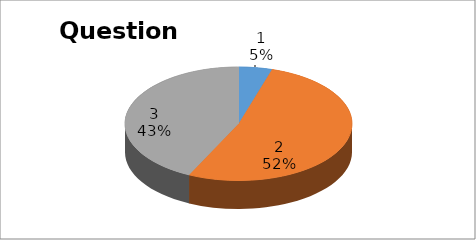
| Category | Series 0 |
|---|---|
| 0 | 10 |
| 1 | 110 |
| 2 | 90 |